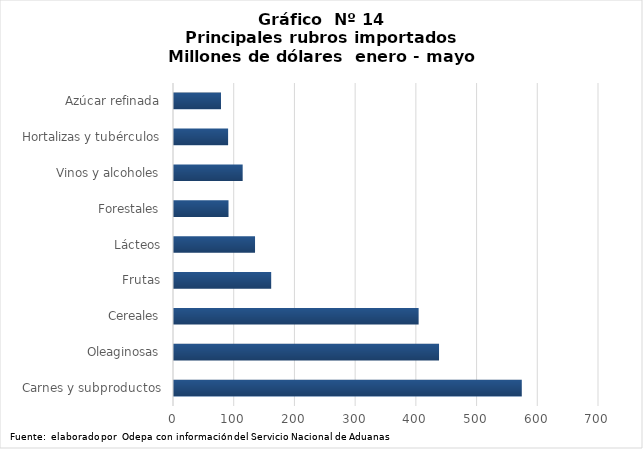
| Category | Series 0 |
|---|---|
| Carnes y subproductos | 572826.17 |
| Oleaginosas | 436531.509 |
| Cereales | 402914.209 |
| Frutas | 160080.625 |
| Lácteos | 133475.404 |
| Forestales | 89784 |
| Vinos y alcoholes | 113102.43 |
| Hortalizas y tubérculos | 89113.075 |
| Azúcar refinada | 77393.708 |